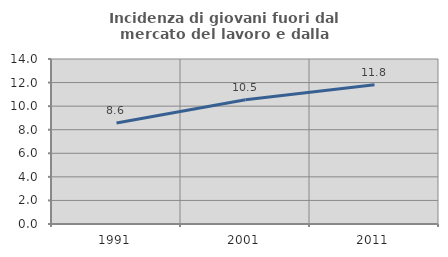
| Category | Incidenza di giovani fuori dal mercato del lavoro e dalla formazione  |
|---|---|
| 1991.0 | 8.563 |
| 2001.0 | 10.543 |
| 2011.0 | 11.806 |